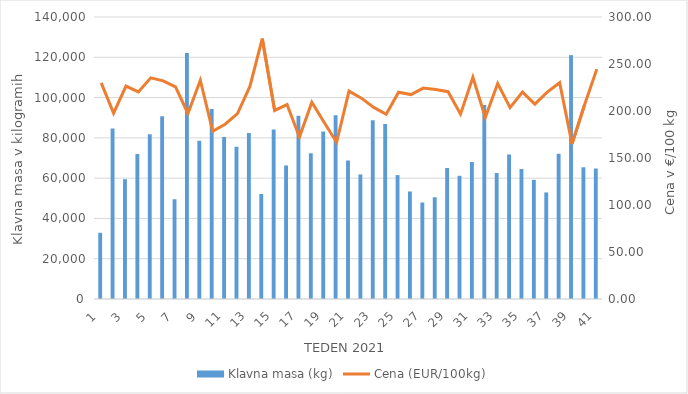
| Category | Klavna masa (kg) |
|---|---|
| 1.0 | 32871 |
| 2.0 | 84639 |
| 3.0 | 59476 |
| 4.0 | 72013 |
| 5.0 | 81759 |
| 6.0 | 90669 |
| 7.0 | 49517 |
| 8.0 | 122111 |
| 9.0 | 78545 |
| 10.0 | 94384 |
| 11.0 | 80405 |
| 12.0 | 75534 |
| 13.0 | 82440 |
| 14.0 | 52143 |
| 15.0 | 84105 |
| 16.0 | 66298 |
| 17.0 | 90925 |
| 18.0 | 72394 |
| 19.0 | 83193 |
| 20.0 | 91231 |
| 21.0 | 68763 |
| 22.0 | 61837 |
| 23.0 | 88747 |
| 24.0 | 86888 |
| 25.0 | 61507 |
| 26.0 | 53379 |
| 27.0 | 47910 |
| 28.0 | 50529 |
| 29.0 | 65062 |
| 30.0 | 61178 |
| 31.0 | 67992 |
| 32.0 | 96308 |
| 33.0 | 62558 |
| 34.0 | 71729 |
| 35.0 | 64596 |
| 36.0 | 59160 |
| 37.0 | 52905 |
| 38.0 | 72159 |
| 39.0 | 121060 |
| 40.0 | 65445 |
| 41.0 | 64780 |